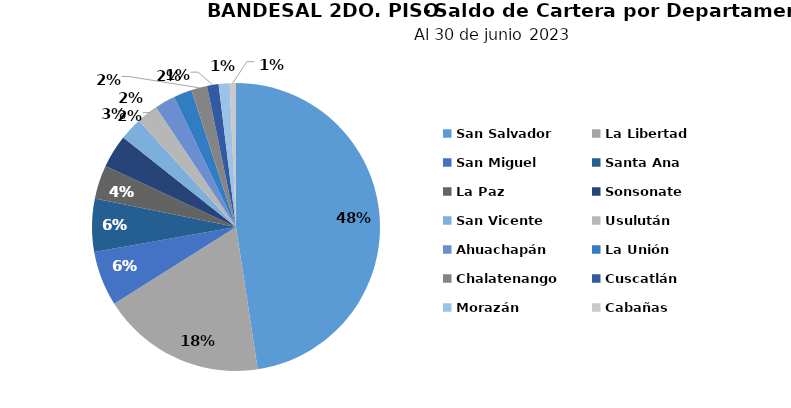
| Category | Saldo |
|---|---|
| San Salvador | 216.54 |
| La Libertad | 83.942 |
| San Miguel | 28.086 |
| Santa Ana | 27.139 |
| La Paz | 17.175 |
| Sonsonate | 16.956 |
| San Vicente | 11.583 |
| Usulután | 10.934 |
| Ahuachapán | 10.455 |
| La Unión | 9.379 |
| Chalatenango | 8.105 |
| Cuscatlán | 5.892 |
| Morazán | 5.653 |
| Cabañas | 3.145 |